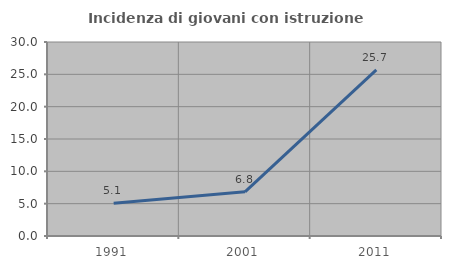
| Category | Incidenza di giovani con istruzione universitaria |
|---|---|
| 1991.0 | 5.056 |
| 2001.0 | 6.832 |
| 2011.0 | 25.688 |